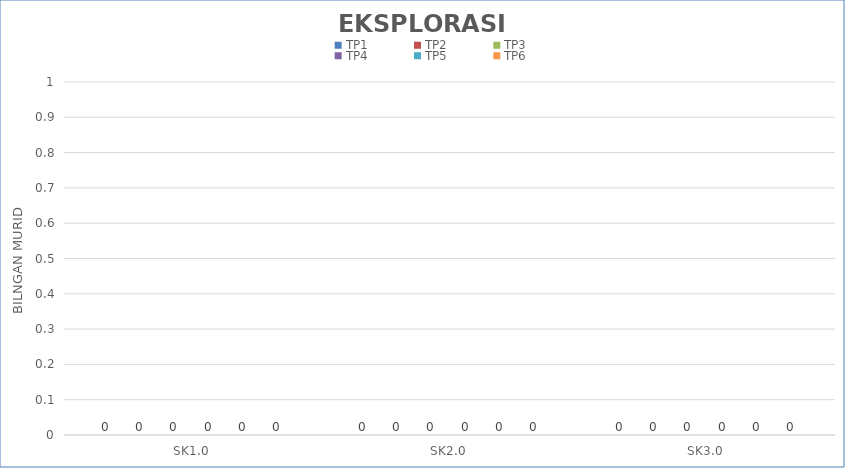
| Category | TP1 | TP2 | TP3 | TP4 | TP5 | TP6 |
|---|---|---|---|---|---|---|
| SK1.0 | 0 | 0 | 0 | 0 | 0 | 0 |
| SK2.0 | 0 | 0 | 0 | 0 | 0 | 0 |
| SK3.0 | 0 | 0 | 0 | 0 | 0 | 0 |